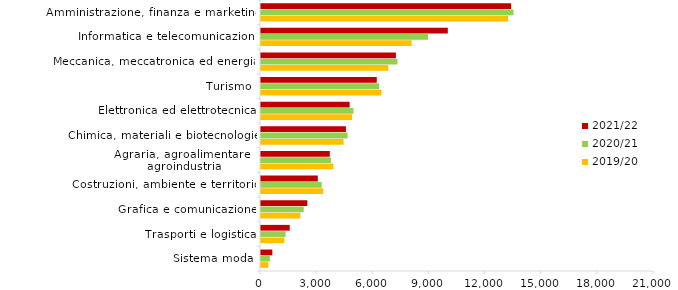
| Category | 2019/20 | 2020/21 | 2021/22 |
|---|---|---|---|
| Sistema moda | 400 | 474 | 606 |
| Trasporti e logistica | 1251 | 1318 | 1535 |
| Grafica e comunicazione | 2108 | 2285 | 2476 |
| Costruzioni, ambiente e territorio | 3324 | 3245 | 3035 |
| Agraria, agroalimentare e agroindustria | 3870 | 3737 | 3676 |
| Chimica, materiali e biotecnologie | 4414 | 4626 | 4537 |
| Elettronica ed elettrotecnica | 4869 | 4943 | 4736 |
| Turismo | 6436 | 6314 | 6186 |
| Meccanica, meccatronica ed energia | 6804 | 7294 | 7208 |
| Informatica e telecomunicazioni | 8050 | 8925 | 9982 |
| Amministrazione, finanza e marketing | 13203 | 13492 | 13364 |